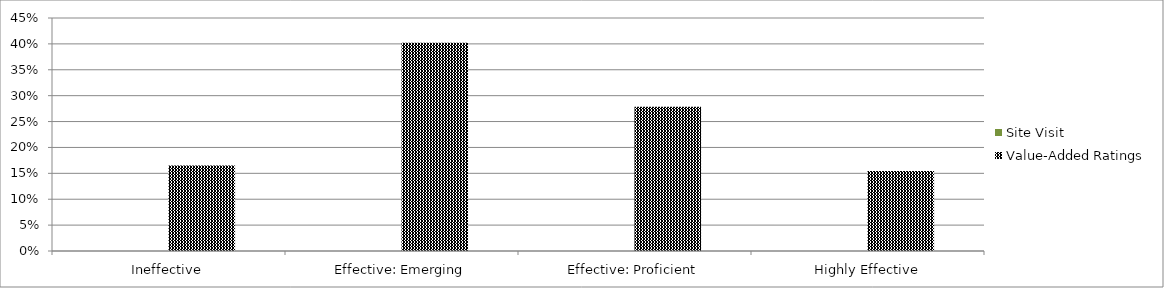
| Category | Site Visit | Value-Added Ratings |
|---|---|---|
| Ineffective | 0 | 16.49 |
| Effective: Emerging | 0 | 40.21 |
| Effective: Proficient | 0 | 27.84 |
| Highly Effective | 0 | 15.46 |